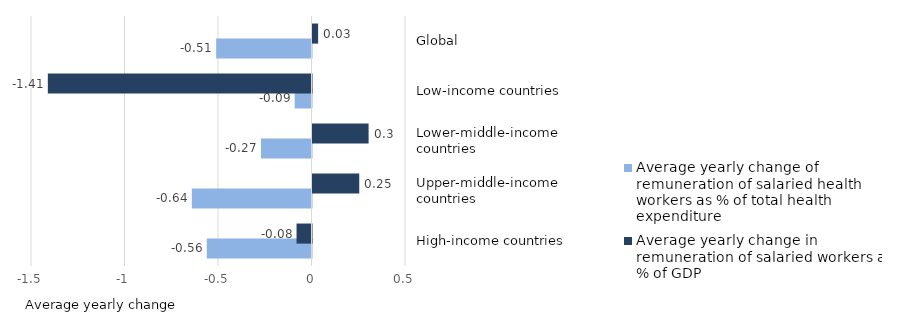
| Category | Average yearly change of remuneration of salaried health workers as % of total health expenditure | Average yearly change in remuneration of salaried workers as % of GDP |
|---|---|---|
| High-income countries | -0.56 | -0.08 |
| Upper-middle-income countries | -0.64 | 0.25 |
| Lower-middle-income countries  | -0.27 | 0.3 |
| Low-income countries  | -0.09 | -1.41 |
| Global | -0.51 | 0.03 |